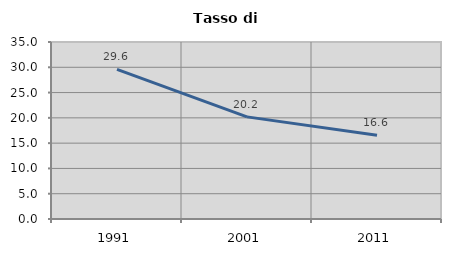
| Category | Tasso di disoccupazione   |
|---|---|
| 1991.0 | 29.572 |
| 2001.0 | 20.195 |
| 2011.0 | 16.558 |